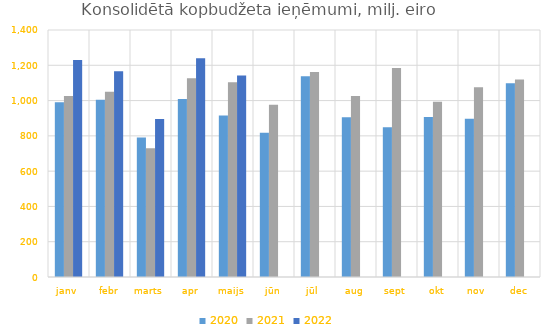
| Category | 2020 | 2021 | 2022 |
|---|---|---|---|
| janv | 990255.966 | 1025729.219 | 1230170.047 |
| febr | 1003986.803 | 1050032.948 | 1166379.907 |
| marts | 790973.859 | 729450.354 | 896198.796 |
| apr | 1008343.173 | 1125852.842 | 1240480.294 |
| maijs | 915661.348 | 1104155.322 | 1141583.555 |
| jūn | 817524.851 | 976600.628 | 0 |
| jūl | 1137278.065 | 1162632.002 | 0 |
| aug | 905597.447 | 1025720.022 | 0 |
| sept | 848822.405 | 1184851.081 | 0 |
| okt | 906227.444 | 993429.183 | 0 |
| nov | 896995.399 | 1074941.099 | 0 |
| dec | 1098839.178 | 1118858.021 | 0 |